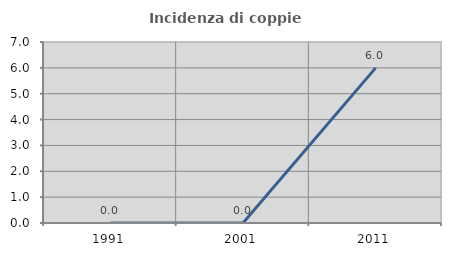
| Category | Incidenza di coppie miste |
|---|---|
| 1991.0 | 0 |
| 2001.0 | 0 |
| 2011.0 | 6 |